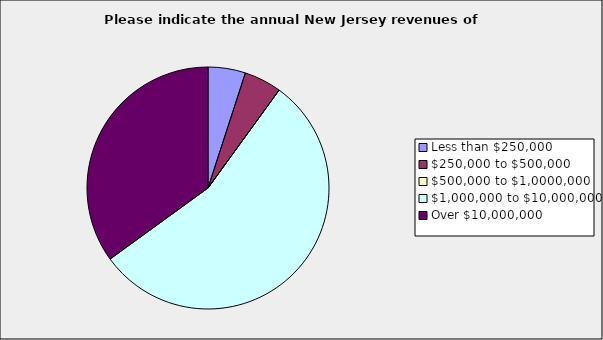
| Category | Series 0 |
|---|---|
| Less than $250,000 | 0.05 |
| $250,000 to $500,000 | 0.05 |
| $500,000 to $1,0000,000 | 0 |
| $1,000,000 to $10,000,000 | 0.55 |
| Over $10,000,000 | 0.35 |